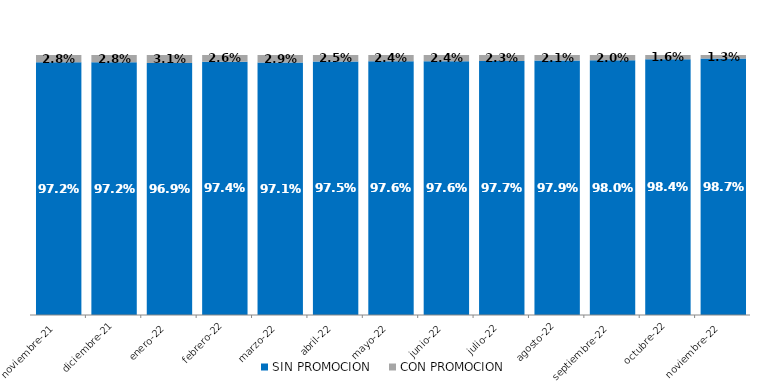
| Category | SIN PROMOCION   | CON PROMOCION   |
|---|---|---|
| 2021-11-01 | 0.972 | 0.028 |
| 2021-12-01 | 0.972 | 0.028 |
| 2022-01-01 | 0.969 | 0.031 |
| 2022-02-01 | 0.974 | 0.026 |
| 2022-03-01 | 0.971 | 0.029 |
| 2022-04-01 | 0.975 | 0.025 |
| 2022-05-01 | 0.976 | 0.024 |
| 2022-06-01 | 0.976 | 0.024 |
| 2022-07-01 | 0.977 | 0.023 |
| 2022-08-01 | 0.979 | 0.021 |
| 2022-09-01 | 0.98 | 0.02 |
| 2022-10-01 | 0.984 | 0.016 |
| 2022-11-01 | 0.987 | 0.013 |